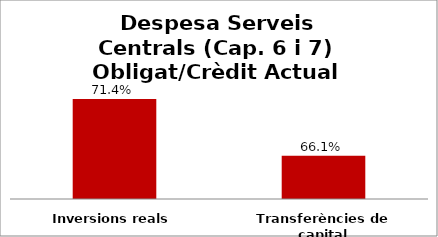
| Category | Series 0 |
|---|---|
| Inversions reals | 0.714 |
| Transferències de capital | 0.661 |